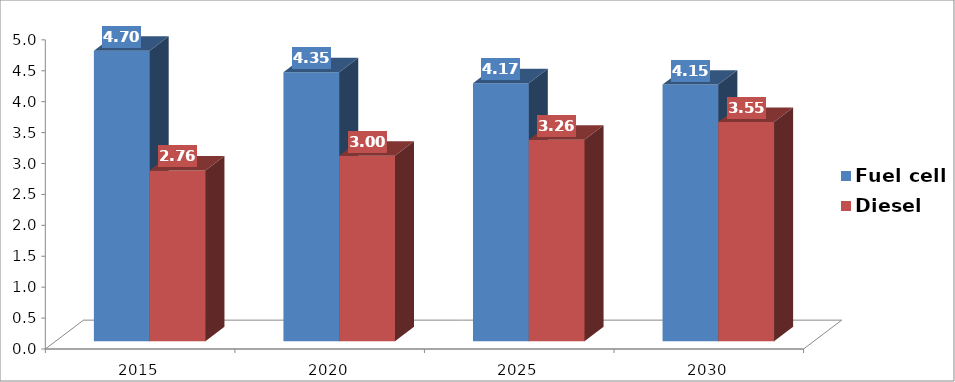
| Category | Fuel cell | Diesel |
|---|---|---|
| 2015.0 | 4.698 | 2.763 |
| 2020.0 | 4.352 | 3 |
| 2025.0 | 4.172 | 3.26 |
| 2030.0 | 4.15 | 3.546 |